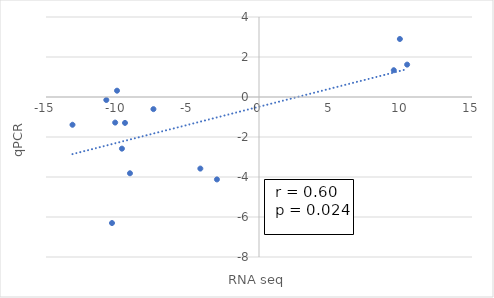
| Category | qPCR |
|---|---|
| -10.12862928 | -1.279 |
| -9.997974295 | 0.316 |
| 9.920105439 | 2.9 |
| -9.436938408 | -1.295 |
| -7.434048407 | -0.606 |
| -10.75257495 | -0.15 |
| -4.130835518 | -3.579 |
| 10.43157083 | 1.619 |
| -2.962343929 | -4.121 |
| 9.491849551 | 1.339 |
| -13.13427672 | -1.388 |
| -10.35228918 | -6.302 |
| -9.652448023 | -2.582 |
| -9.086844747 | -3.814 |